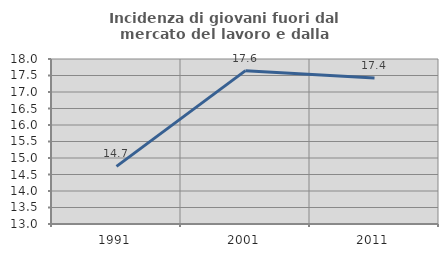
| Category | Incidenza di giovani fuori dal mercato del lavoro e dalla formazione  |
|---|---|
| 1991.0 | 14.747 |
| 2001.0 | 17.647 |
| 2011.0 | 17.424 |